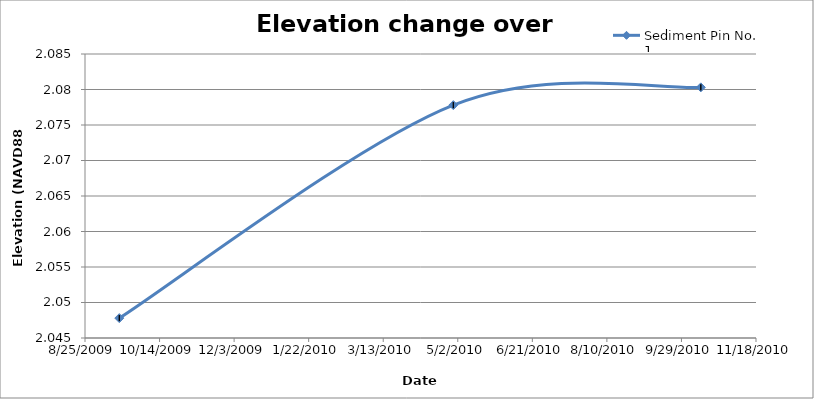
| Category | Sediment Pin No. 1 |
|---|---|
| 40073.0 | 2.048 |
| 40297.0 | 2.078 |
| 40463.0 | 2.08 |